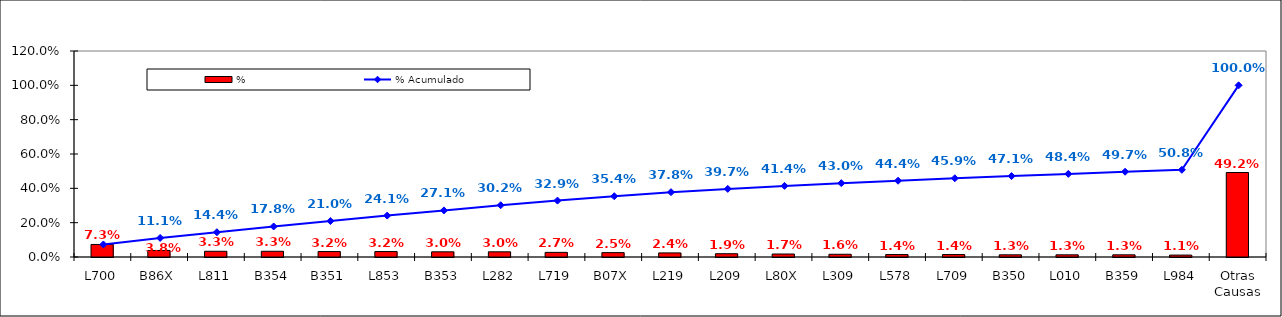
| Category | % |
|---|---|
| L700 | 0.073 |
| B86X | 0.038 |
| L811 | 0.033 |
| B354 | 0.033 |
| B351 | 0.032 |
| L853 | 0.032 |
| B353 | 0.03 |
| L282 | 0.03 |
| L719 | 0.027 |
| B07X | 0.025 |
| L219 | 0.024 |
| L209 | 0.019 |
| L80X | 0.017 |
| L309 | 0.016 |
| L578 | 0.014 |
| L709 | 0.014 |
| B350 | 0.013 |
| L010 | 0.013 |
| B359 | 0.013 |
| L984 | 0.011 |
| Otras Causas | 0.492 |